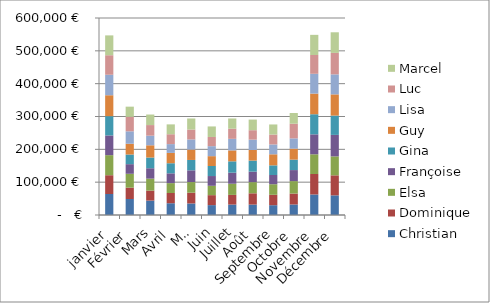
| Category | Christian | Dominique | Elsa | Françoise | Gina | Guy | Lisa | Luc | Marcel |
|---|---|---|---|---|---|---|---|---|---|
| janvier | 63967.24 | 57209.77 | 61083.82 | 60061.91 | 58720.46 | 63709.82 | 62368.63 | 59494.54 | 60428.42 |
| Février | 48777.58 | 34569.04 | 42166.68 | 29322.22 | 29359.51 | 32814.69 | 37850.68 | 44136.1 | 30986.63 |
| Mars | 43872.52 | 30467.53 | 36407.5 | 31677.85 | 32652.52 | 37256.69 | 29293.97 | 32265.83 | 32104.06 |
| Avril | 35834.79 | 31252.31 | 29970.48 | 29892.45 | 30710.49 | 31482.89 | 26778.53 | 30061.7 | 30025.29 |
| Mai | 35131.58 | 32807.68 | 32361.44 | 35767.63 | 31592.33 | 31650.7 | 30792.67 | 30192.81 | 33688.88 |
| Juin | 30096.37 | 30356.19 | 28490.14 | 29739.8 | 30635.72 | 29909.86 | 30406.53 | 28012.59 | 32086.96 |
| Juillet | 31758.59 | 29454.92 | 34033.95 | 33644.82 | 34565.76 | 33298.21 | 35219.47 | 30874.04 | 31152.94 |
| Août | 31682.28 | 34417.57 | 34009.49 | 31915.91 | 33718.5 | 32174.96 | 31667.1 | 28673.83 | 32376.45 |
| Septembre | 29854.91 | 31665.99 | 32200.56 | 28072.22 | 29429.25 | 33641.48 | 29969.01 | 30189.41 | 30727.23 |
| Octobre | 31967.85 | 33337.51 | 37896.87 | 33622.5 | 31824.37 | 33463.81 | 31255.91 | 44626.98 | 32615.85 |
| Novembre | 62456.19 | 62363.56 | 60028.83 | 60833.06 | 61219.29 | 62878.15 | 60268.26 | 57259.02 | 61371.74 |
| Décembre | 59816.13 | 60995.6 | 57683.74 | 65466.78 | 58806.7 | 64620.79 | 60935.14 | 65394.76 | 62797.37 |